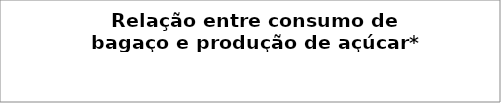
| Category | t bagaço/ t açúcar equivalente |
|---|---|
| 70006.65 | 3.975 |
| 186093.0 | 1.059 |
| 319615.0 | 1.874 |
| 359096.55 | 1.8 |
| 143551.0 | 8.496 |
| 114752.0 | 0.958 |
| 171877.0 | 2.503 |
| 264721.0 | 2.446 |
| 188278.0 | 4.016 |
| 316300.0 | 2.697 |
| 682500.0 | 7.473 |
| 271424.0 | 3.848 |
| 15000.0 | 3.333 |
| 110416.5 | 1.505 |
| 102893.0 | 8.443 |
| 81621.0 | 0.809 |
| 50000.0 | 0.966 |
| 332500.0 | 2.547 |
| 63000.0 | 2.735 |
| 150820.61 | 2.414 |
| 473527.0 | 4.096 |
| 5852.17 | 16.317 |
| 351434.0 | 2.667 |
| 154544.0 | 2.138 |
| 93442.0 | 2.237 |
| 159076.0 | 2.684 |
| 175898.0 | 3.056 |
| 113212.0 | 3.201 |
| 121590.0 | 2.939 |
| 89000.0 | 3.271 |
| 300000.0 | 2.096 |
| 794644.0 | 0.998 |
| 57750.0 | 2.846 |
| 305311.0 | 2.04 |
| 145381.9 | 2.728 |
| 209575.06800000003 | 3.075 |